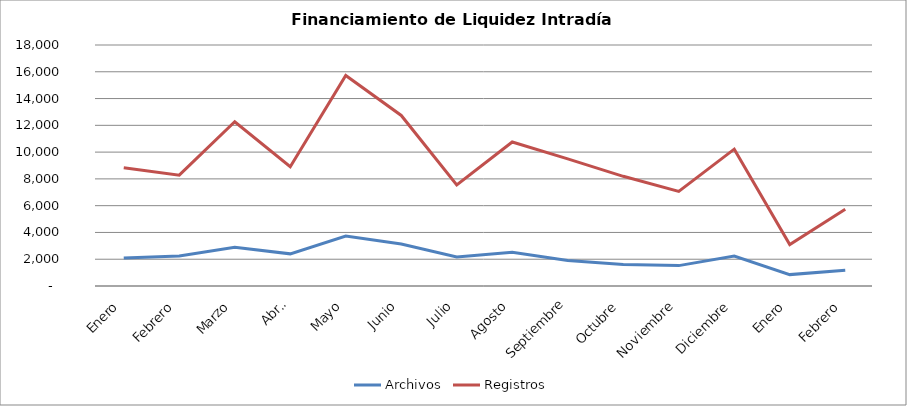
| Category | Archivos | Registros |
|---|---|---|
| Enero | 2088 | 8836 |
| Febrero | 2248 | 8277 |
| Marzo | 2891 | 12267 |
| Abril | 2401 | 8907 |
| Mayo | 3728 | 15728 |
| Junio | 3131 | 12737 |
| Julio | 2163 | 7550 |
| Agosto | 2519 | 10756 |
| Septiembre | 1907 | 9493 |
| Octubre | 1604 | 8192 |
| Noviembre | 1522 | 7069 |
| Diciembre | 2230 | 10219 |
| Enero | 851 | 3094 |
| Febrero | 1182 | 5726 |